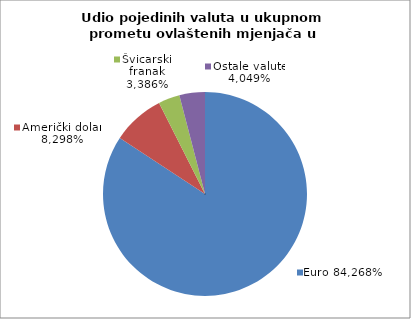
| Category | EUR |
|---|---|
| 0 | 84.268 |
| 1 | 8.298 |
| 2 | 3.386 |
| 3 | 4.049 |